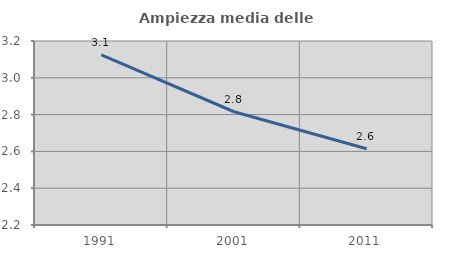
| Category | Ampiezza media delle famiglie |
|---|---|
| 1991.0 | 3.125 |
| 2001.0 | 2.815 |
| 2011.0 | 2.615 |